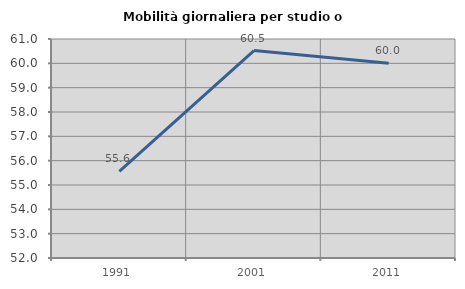
| Category | Mobilità giornaliera per studio o lavoro |
|---|---|
| 1991.0 | 55.556 |
| 2001.0 | 60.526 |
| 2011.0 | 60 |